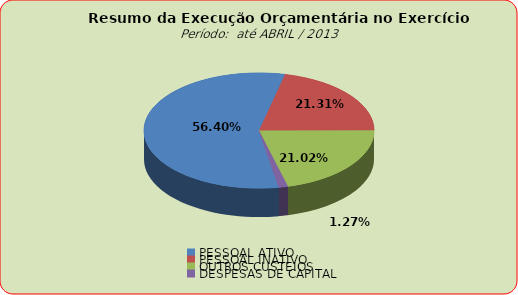
| Category | Series 0 |
|---|---|
| PESSOAL ATIVO | 31284686.9 |
| PESSOAL INATIVO | 11820817.22 |
| OUTROS CUSTEIOS | 11657217.8 |
| DESPESAS DE CAPITAL | 703673.81 |